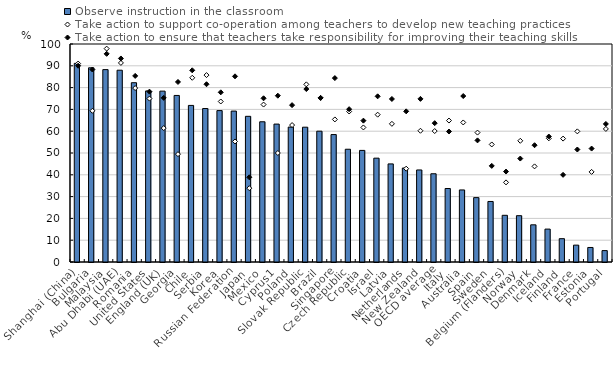
| Category | Observe instruction in the classroom |
|---|---|
| Shanghai (China) | 91.127 |
| Bulgaria | 89.08 |
| Malaysia | 88.246 |
| Abu Dhabi (UAE) | 87.978 |
| Romania | 82.241 |
| United States | 78.483 |
| England (UK) | 78.377 |
| Georgia | 76.399 |
| Chile | 71.827 |
| Serbia | 70.399 |
| Korea | 69.446 |
| Russian Federation | 69.235 |
| Japan | 66.826 |
| Mexico | 64.326 |
| Cyprus1 | 63.265 |
| Poland | 61.89 |
| Slovak Republic | 61.84 |
| Brazil | 60.01 |
| Singapore | 58.456 |
| Czech Republic | 51.725 |
| Croatia | 51.193 |
| Israel | 47.631 |
| Latvia | 44.993 |
| Netherlands | 43.108 |
| New Zealand | 42.22 |
| OECD average | 40.476 |
| Italy | 33.712 |
| Australia | 33.052 |
| Spain | 29.532 |
| Sweden | 27.763 |
| Belgium (Flanders) | 21.42 |
| Norway | 21.247 |
| Denmark | 17.052 |
| Iceland | 15.094 |
| Finland | 10.698 |
| France | 7.739 |
| Estonia | 6.664 |
| Portugal | 5.229 |